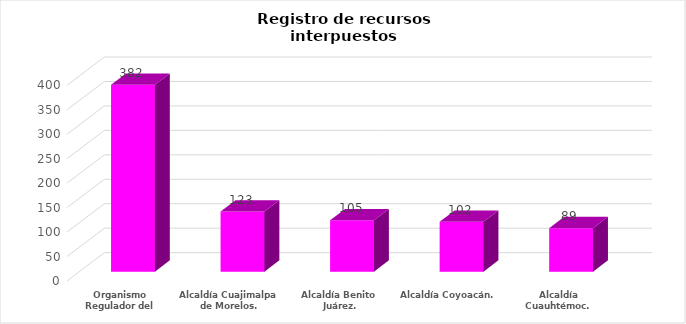
| Category | Registro de recursos interpuestos (IP) |
|---|---|
| Organismo Regulador del Transporte. | 382 |
| Alcaldía Cuajimalpa de Morelos. | 123 |
| Alcaldía Benito Juárez. | 105 |
| Alcaldía Coyoacán. | 102 |
| Alcaldía Cuauhtémoc. | 89 |